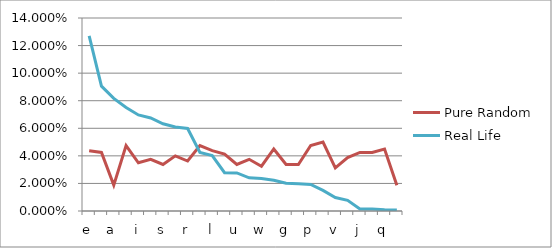
| Category | Pure Random | Real Life |
|---|---|---|
| e | 0.044 | 0.127 |
| t | 0.042 | 0.091 |
| a | 0.019 | 0.082 |
| o | 0.048 | 0.075 |
| i | 0.035 | 0.07 |
| n | 0.038 | 0.068 |
| s | 0.034 | 0.063 |
| h | 0.04 | 0.061 |
| r | 0.036 | 0.06 |
| d | 0.048 | 0.043 |
| l | 0.044 | 0.04 |
| c | 0.041 | 0.028 |
| u | 0.034 | 0.028 |
| m | 0.038 | 0.024 |
| w | 0.032 | 0.024 |
| f | 0.045 | 0.022 |
| g | 0.034 | 0.02 |
| y | 0.034 | 0.02 |
| p | 0.048 | 0.019 |
| b | 0.05 | 0.015 |
| v | 0.031 | 0.01 |
| k | 0.039 | 0.008 |
| j | 0.042 | 0.002 |
| x | 0.042 | 0.002 |
| q | 0.045 | 0.001 |
| z | 0.019 | 0.001 |